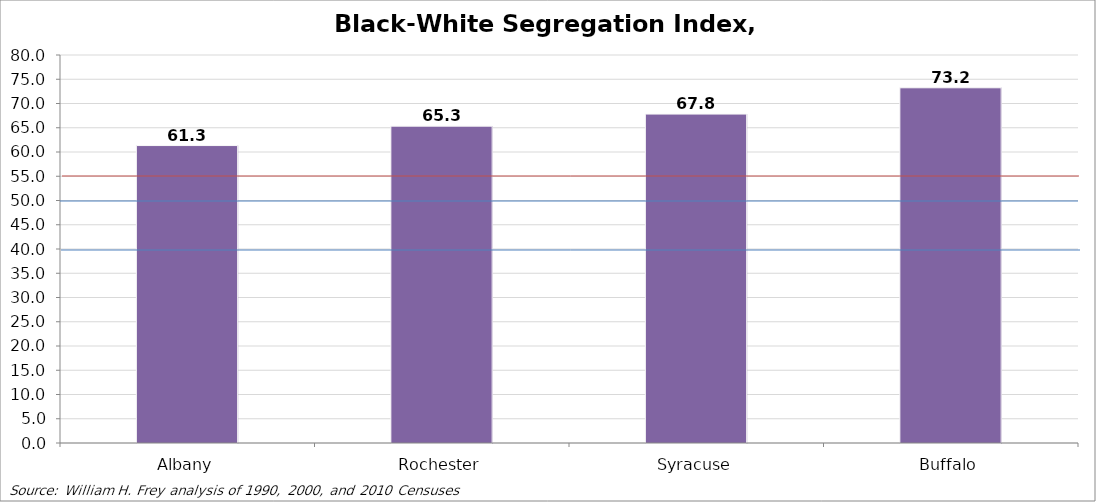
| Category | Black-White Segregation Index, 2010 |
|---|---|
| Albany | 61.33 |
| Rochester | 65.33 |
| Syracuse | 67.82 |
| Buffalo | 73.24 |